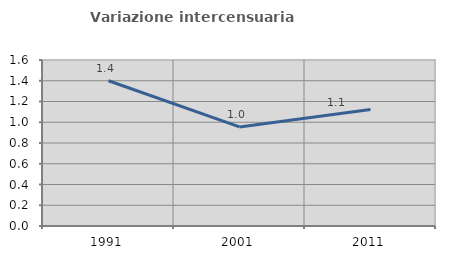
| Category | Variazione intercensuaria annua |
|---|---|
| 1991.0 | 1.4 |
| 2001.0 | 0.955 |
| 2011.0 | 1.122 |